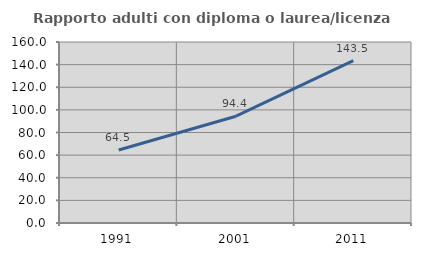
| Category | Rapporto adulti con diploma o laurea/licenza media  |
|---|---|
| 1991.0 | 64.516 |
| 2001.0 | 94.382 |
| 2011.0 | 143.529 |